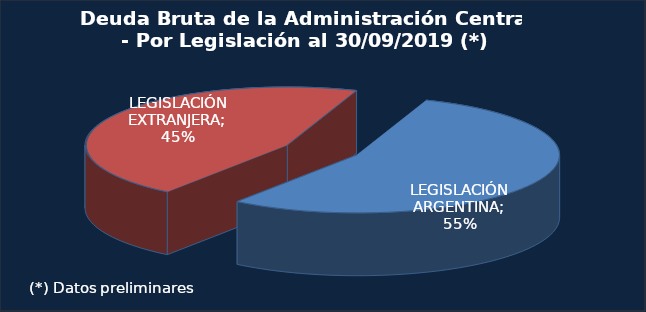
| Category | Series 0 |
|---|---|
| I- LEGISLACIÓN ARGENTINA | 169801.4 |
| II- LEGISLACIÓN EXTRANJERA | 141438.9 |